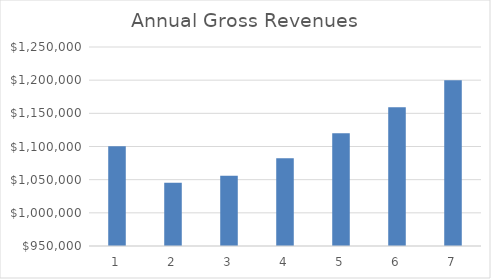
| Category | Series 0 |
|---|---|
| 0 | 1100305 |
| 1 | 1045289.75 |
| 2 | 1055742.648 |
| 3 | 1082136.214 |
| 4 | 1120010.981 |
| 5 | 1159211.366 |
| 6 | 1199783.763 |